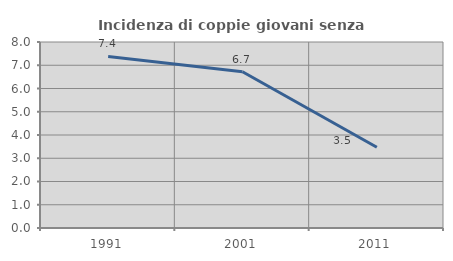
| Category | Incidenza di coppie giovani senza figli |
|---|---|
| 1991.0 | 7.377 |
| 2001.0 | 6.723 |
| 2011.0 | 3.472 |